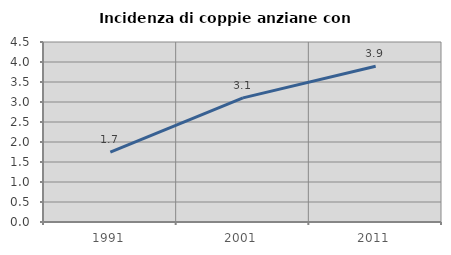
| Category | Incidenza di coppie anziane con figli |
|---|---|
| 1991.0 | 1.748 |
| 2001.0 | 3.103 |
| 2011.0 | 3.894 |